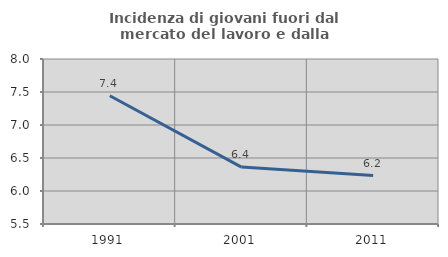
| Category | Incidenza di giovani fuori dal mercato del lavoro e dalla formazione  |
|---|---|
| 1991.0 | 7.443 |
| 2001.0 | 6.363 |
| 2011.0 | 6.234 |